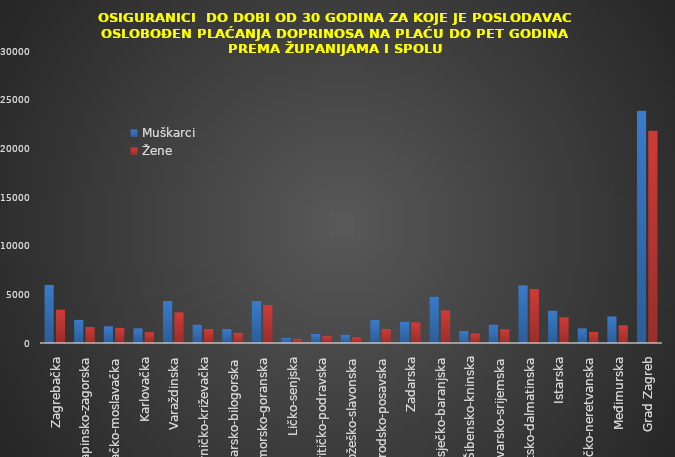
| Category | Muškarci | Žene |
|---|---|---|
| Zagrebačka | 5971 | 3435 |
| Krapinsko-zagorska | 2382 | 1640 |
| Sisačko-moslavačka | 1717 | 1579 |
| Karlovačka | 1501 | 1122 |
| Varaždinska | 4310 | 3144 |
| Koprivničko-križevačka | 1880 | 1425 |
| Bjelovarsko-bilogorska | 1434 | 1049 |
| Primorsko-goranska | 4312 | 3901 |
| Ličko-senjska | 542 | 416 |
| Virovitičko-podravska | 930 | 711 |
| Požeško-slavonska | 865 | 583 |
| Brodsko-posavska | 2355 | 1431 |
| Zadarska | 2205 | 2124 |
| Osječko-baranjska | 4775 | 3348 |
| Šibensko-kninska | 1220 | 976 |
| Vukovarsko-srijemska | 1880 | 1399 |
| Splitsko-dalmatinska | 5915 | 5551 |
| Istarska | 3332 | 2643 |
| Dubrovačko-neretvanska | 1501 | 1150 |
| Međimurska | 2722 | 1822 |
| Grad Zagreb | 23853 | 21805 |